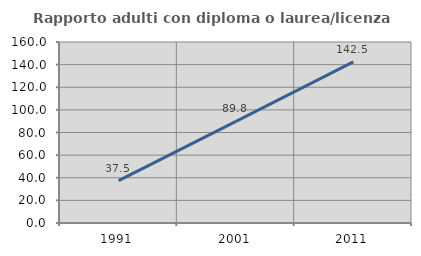
| Category | Rapporto adulti con diploma o laurea/licenza media  |
|---|---|
| 1991.0 | 37.5 |
| 2001.0 | 89.831 |
| 2011.0 | 142.453 |